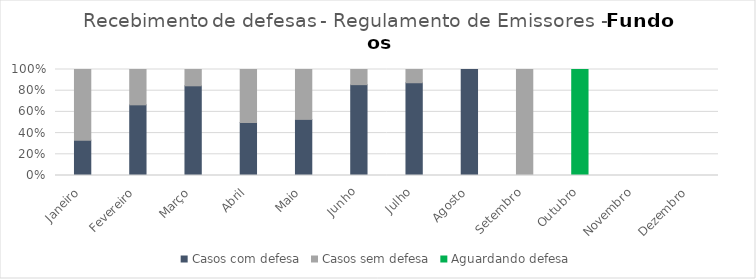
| Category | Casos com defesa | Casos sem defesa | Aguardando defesa |
|---|---|---|---|
| Janeiro | 5 | 10 | 0 |
| Fevereiro | 2 | 1 | 0 |
| Março | 11 | 2 | 0 |
| Abril | 1 | 1 | 0 |
| Maio | 9 | 8 | 0 |
| Junho | 6 | 1 | 0 |
| Julho | 7 | 1 | 0 |
| Agosto | 5 | 0 | 0 |
| Setembro | 0 | 1 | 0 |
| Outubro | 0 | 0 | 1 |
| Novembro | 0 | 0 | 0 |
| Dezembro | 0 | 0 | 0 |